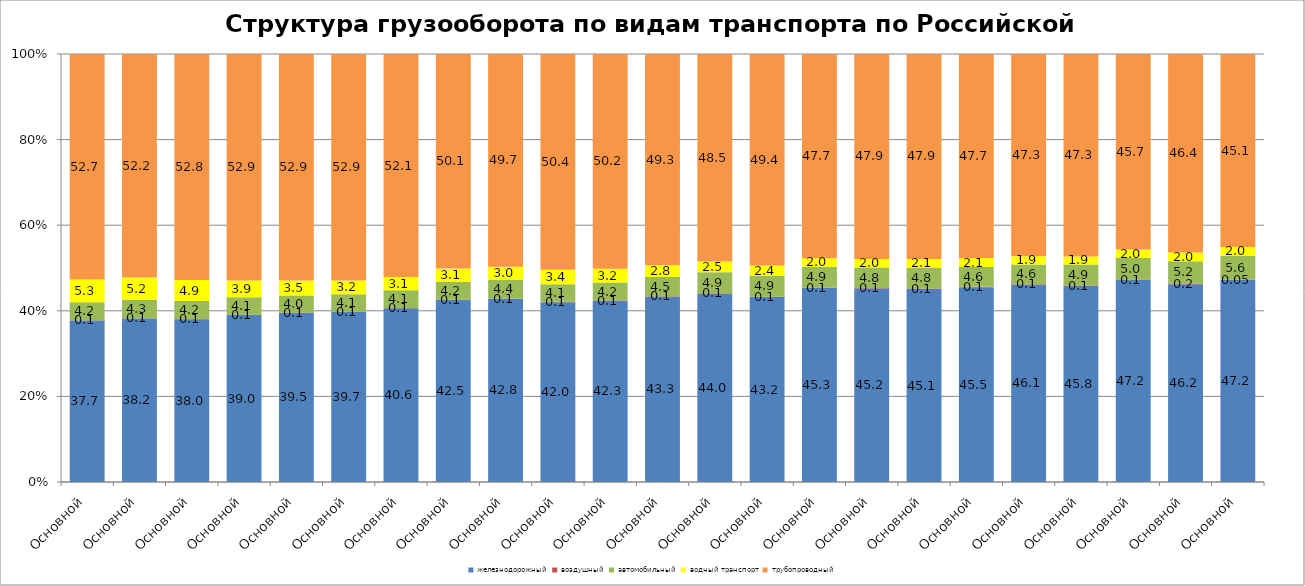
| Category | железнодорожный | воздушный | автомобильный | водный транспорт | трубопроводный |
|---|---|---|---|---|---|
| 2000.0 | 37.7 | 0.07 | 4.2 | 5.3 | 52.7 |
| 2001.0 | 38.2 | 0.07 | 4.3 | 5.2 | 52.2 |
| 2002.0 | 38 | 0.07 | 4.2 | 4.9 | 52.8 |
| 2003.0 | 39 | 0.06 | 4.1 | 3.9 | 52.9 |
| 2004.0 | 39.5 | 0.07 | 4 | 3.5 | 52.9 |
| 2005.0 | 39.7 | 0.06 | 4.1 | 3.2 | 52.9 |
| 2006.0 | 40.6 | 0.06 | 4.1 | 3.1 | 52.1 |
| 2007.0 | 42.5 | 0.07 | 4.2 | 3.1 | 50.1 |
| 2008.0 | 42.8 | 0.07 | 4.4 | 3 | 49.7 |
| 2009.0 | 42 | 0.08 | 4.1 | 3.4 | 50.4 |
| 2010.0 | 42.3 | 0.1 | 4.2 | 3.2 | 50.2 |
| 2011.0 | 43.3 | 0.1 | 4.5 | 2.8 | 49.3 |
| 2012.0 | 44 | 0.1 | 4.9 | 2.5 | 48.5 |
| 2013.0 | 43.2 | 0.1 | 4.9 | 2.4 | 49.4 |
| 2014.0 | 45.3 | 0.1 | 4.9 | 2 | 47.7 |
| 2015.0 | 45.2 | 0.11 | 4.8 | 2 | 47.9 |
| 2016.0 | 45.1 | 0.13 | 4.8 | 2.1 | 47.9 |
| 2017.0 | 45.5 | 0.14 | 4.6 | 2.1 | 47.7 |
| 2018.0 | 46.1 | 0.14 | 4.6 | 1.9 | 47.3 |
| 2019.0 | 45.8 | 0.13 | 4.9 | 1.9 | 47.3 |
| 2020.0 | 47.2 | 0.13 | 5 | 2 | 45.7 |
| 2021.0 | 46.2 | 0.2 | 5.2 | 2 | 46.4 |
| 2022.0 | 47.2 | 0.05 | 5.6 | 2 | 45.1 |